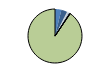
| Category | Series 0 |
|---|---|
| ARRASTRE | 36 |
| CERCO | 33 |
| ATUNEROS CAÑEROS | 2 |
| PALANGRE DE FONDO | 5 |
| PALANGRE DE SUPERFICIE | 11 |
| RASCO | 0 |
| VOLANTA | 1 |
| ARTES FIJAS | 2 |
| ARTES MENORES | 855 |